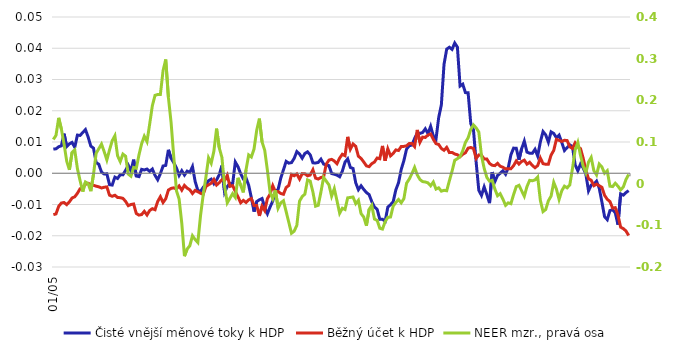
| Category | Čisté vnější měnové toky k HDP | Běžný účet k HDP |
|---|---|---|
| 2005-01-01 | 0.008 | -0.013 |
| 2005-02-01 | 0.008 | -0.013 |
| 2005-03-01 | 0.008 | -0.011 |
| 2005-04-01 | 0.009 | -0.01 |
| 2005-05-01 | 0.013 | -0.009 |
| 2005-06-01 | 0.009 | -0.01 |
| 2005-07-01 | 0.009 | -0.009 |
| 2005-08-01 | 0.01 | -0.008 |
| 2005-09-01 | 0.008 | -0.008 |
| 2005-10-01 | 0.012 | -0.006 |
| 2005-11-01 | 0.012 | -0.005 |
| 2005-12-01 | 0.013 | -0.004 |
| 2006-01-01 | 0.014 | -0.004 |
| 2006-02-01 | 0.012 | -0.003 |
| 2006-03-01 | 0.009 | -0.004 |
| 2006-04-01 | 0.008 | -0.004 |
| 2006-05-01 | 0.003 | -0.004 |
| 2006-06-01 | 0.003 | -0.004 |
| 2006-07-01 | 0 | -0.005 |
| 2006-08-01 | 0 | -0.004 |
| 2006-09-01 | 0 | -0.004 |
| 2006-10-01 | -0.004 | -0.007 |
| 2006-11-01 | -0.004 | -0.007 |
| 2006-12-01 | -0.001 | -0.007 |
| 2007-01-01 | -0.002 | -0.008 |
| 2007-02-01 | 0 | -0.008 |
| 2007-03-01 | -0.001 | -0.008 |
| 2007-04-01 | 0.001 | -0.009 |
| 2007-05-01 | 0.003 | -0.01 |
| 2007-06-01 | 0.001 | -0.01 |
| 2007-07-01 | 0.004 | -0.01 |
| 2007-08-01 | -0.001 | -0.013 |
| 2007-09-01 | -0.001 | -0.013 |
| 2007-10-01 | 0.001 | -0.013 |
| 2007-11-01 | 0.001 | -0.012 |
| 2007-12-01 | 0.001 | -0.013 |
| 2008-01-01 | 0.001 | -0.012 |
| 2008-02-01 | 0.001 | -0.011 |
| 2008-03-01 | -0.001 | -0.012 |
| 2008-04-01 | -0.002 | -0.009 |
| 2008-05-01 | 0 | -0.008 |
| 2008-06-01 | 0.002 | -0.009 |
| 2008-07-01 | 0.003 | -0.008 |
| 2008-08-01 | 0.008 | -0.005 |
| 2008-09-01 | 0.005 | -0.005 |
| 2008-10-01 | 0.003 | -0.005 |
| 2008-11-01 | 0.002 | -0.005 |
| 2008-12-01 | -0.001 | -0.004 |
| 2009-01-01 | 0.001 | -0.005 |
| 2009-02-01 | -0.001 | -0.004 |
| 2009-03-01 | 0.001 | -0.005 |
| 2009-04-01 | 0 | -0.005 |
| 2009-05-01 | 0.002 | -0.006 |
| 2009-06-01 | -0.003 | -0.005 |
| 2009-07-01 | -0.005 | -0.006 |
| 2009-08-01 | -0.006 | -0.006 |
| 2009-09-01 | -0.005 | -0.007 |
| 2009-10-01 | -0.004 | -0.004 |
| 2009-11-01 | -0.002 | -0.004 |
| 2009-12-01 | -0.002 | -0.003 |
| 2010-01-01 | -0.003 | -0.002 |
| 2010-02-01 | -0.002 | -0.004 |
| 2010-03-01 | 0 | -0.003 |
| 2010-04-01 | 0.002 | -0.002 |
| 2010-05-01 | -0.006 | -0.002 |
| 2010-06-01 | -0.004 | -0.001 |
| 2010-07-01 | -0.003 | -0.004 |
| 2010-08-01 | -0.003 | -0.004 |
| 2010-09-01 | 0.004 | -0.006 |
| 2010-10-01 | 0.002 | -0.008 |
| 2010-11-01 | 0 | -0.009 |
| 2010-12-01 | -0.002 | -0.009 |
| 2011-01-01 | -0.001 | -0.009 |
| 2011-02-01 | -0.004 | -0.008 |
| 2011-03-01 | -0.008 | -0.008 |
| 2011-04-01 | -0.012 | -0.01 |
| 2011-05-01 | -0.009 | -0.01 |
| 2011-06-01 | -0.008 | -0.014 |
| 2011-07-01 | -0.008 | -0.011 |
| 2011-08-01 | -0.011 | -0.012 |
| 2011-09-01 | -0.013 | -0.008 |
| 2011-10-01 | -0.011 | -0.007 |
| 2011-11-01 | -0.009 | -0.004 |
| 2011-12-01 | -0.006 | -0.006 |
| 2012-01-01 | -0.005 | -0.006 |
| 2012-02-01 | -0.002 | -0.006 |
| 2012-03-01 | 0.001 | -0.007 |
| 2012-04-01 | 0.004 | -0.005 |
| 2012-05-01 | 0.003 | -0.004 |
| 2012-06-01 | 0.003 | 0 |
| 2012-07-01 | 0.005 | -0.001 |
| 2012-08-01 | 0.007 | 0 |
| 2012-09-01 | 0.006 | -0.002 |
| 2012-10-01 | 0.005 | 0 |
| 2012-11-01 | 0.006 | 0 |
| 2012-12-01 | 0.007 | -0.001 |
| 2013-01-01 | 0.006 | -0.001 |
| 2013-02-01 | 0.003 | 0.001 |
| 2013-03-01 | 0.003 | -0.002 |
| 2013-04-01 | 0.003 | -0.002 |
| 2013-05-01 | 0.004 | -0.001 |
| 2013-06-01 | 0.003 | -0.001 |
| 2013-07-01 | 0.003 | 0.003 |
| 2013-08-01 | 0.002 | 0.004 |
| 2013-09-01 | 0 | 0.004 |
| 2013-10-01 | 0 | 0.004 |
| 2013-11-01 | -0.001 | 0.003 |
| 2013-12-01 | -0.001 | 0.005 |
| 2014-01-01 | 0.001 | 0.006 |
| 2014-02-01 | 0.004 | 0.006 |
| 2014-03-01 | 0.005 | 0.012 |
| 2014-04-01 | 0.002 | 0.008 |
| 2014-05-01 | 0.002 | 0.009 |
| 2014-06-01 | -0.003 | 0.009 |
| 2014-07-01 | -0.005 | 0.005 |
| 2014-08-01 | -0.004 | 0.005 |
| 2014-09-01 | -0.005 | 0.004 |
| 2014-10-01 | -0.006 | 0.002 |
| 2014-11-01 | -0.007 | 0.002 |
| 2014-12-01 | -0.009 | 0.003 |
| 2015-01-01 | -0.011 | 0.004 |
| 2015-02-01 | -0.012 | 0.005 |
| 2015-03-01 | -0.015 | 0.005 |
| 2015-04-01 | -0.015 | 0.009 |
| 2015-05-01 | -0.015 | 0.004 |
| 2015-06-01 | -0.011 | 0.008 |
| 2015-07-01 | -0.01 | 0.006 |
| 2015-08-01 | -0.009 | 0.006 |
| 2015-09-01 | -0.005 | 0.007 |
| 2015-10-01 | -0.003 | 0.007 |
| 2015-11-01 | 0.001 | 0.009 |
| 2015-12-01 | 0.004 | 0.009 |
| 2016-01-01 | 0.008 | 0.009 |
| 2016-02-01 | 0.009 | 0.01 |
| 2016-03-01 | 0.009 | 0.01 |
| 2016-04-01 | 0.011 | 0.009 |
| 2016-05-01 | 0.013 | 0.014 |
| 2016-06-01 | 0.013 | 0.01 |
| 2016-07-01 | 0.013 | 0.012 |
| 2016-08-01 | 0.014 | 0.011 |
| 2016-09-01 | 0.013 | 0.012 |
| 2016-10-01 | 0.015 | 0.013 |
| 2016-11-01 | 0.012 | 0.011 |
| 2016-12-01 | 0.011 | 0.009 |
| 2017-01-01 | 0.018 | 0.009 |
| 2017-02-01 | 0.022 | 0.008 |
| 2017-03-01 | 0.035 | 0.007 |
| 2017-04-01 | 0.04 | 0.008 |
| 2017-05-01 | 0.04 | 0.007 |
| 2017-06-01 | 0.04 | 0.007 |
| 2017-07-01 | 0.042 | 0.006 |
| 2017-08-01 | 0.04 | 0.006 |
| 2017-09-01 | 0.028 | 0.005 |
| 2017-10-01 | 0.028 | 0.006 |
| 2017-11-01 | 0.026 | 0.007 |
| 2017-12-01 | 0.026 | 0.008 |
| 2018-01-01 | 0.016 | 0.008 |
| 2018-02-01 | 0.014 | 0.008 |
| 2018-03-01 | 0.004 | 0.005 |
| 2018-04-01 | -0.005 | 0.006 |
| 2018-05-01 | -0.007 | 0.006 |
| 2018-06-01 | -0.004 | 0.005 |
| 2018-07-01 | -0.007 | 0.005 |
| 2018-08-01 | -0.01 | 0.003 |
| 2018-09-01 | 0 | 0.003 |
| 2018-10-01 | -0.003 | 0.002 |
| 2018-11-01 | -0.001 | 0.003 |
| 2018-12-01 | 0 | 0.002 |
| 2019-01-01 | 0.001 | 0.002 |
| 2019-02-01 | 0 | 0.001 |
| 2019-03-01 | 0.002 | 0.001 |
| 2019-04-01 | 0.006 | 0.001 |
| 2019-05-01 | 0.008 | 0.002 |
| 2019-06-01 | 0.008 | 0.004 |
| 2019-07-01 | 0.004 | 0.003 |
| 2019-08-01 | 0.008 | 0.004 |
| 2019-09-01 | 0.01 | 0.004 |
| 2019-10-01 | 0.007 | 0.003 |
| 2019-11-01 | 0.006 | 0.004 |
| 2019-12-01 | 0.006 | 0.002 |
| 2020-01-01 | 0.008 | 0.002 |
| 2020-02-01 | 0.006 | 0.002 |
| 2020-03-01 | 0.01 | 0.005 |
| 2020-04-01 | 0.013 | 0.003 |
| 2020-05-01 | 0.012 | 0.003 |
| 2020-06-01 | 0.01 | 0.003 |
| 2020-07-01 | 0.013 | 0.006 |
| 2020-08-01 | 0.013 | 0.007 |
| 2020-09-01 | 0.011 | 0.011 |
| 2020-10-01 | 0.012 | 0.011 |
| 2020-11-01 | 0.01 | 0.01 |
| 2020-12-01 | 0.007 | 0.011 |
| 2021-01-01 | 0.008 | 0.01 |
| 2021-02-01 | 0.009 | 0.008 |
| 2021-03-01 | 0.008 | 0.008 |
| 2021-04-01 | 0.003 | 0.01 |
| 2021-05-01 | 0.001 | 0.008 |
| 2021-06-01 | 0.003 | 0.008 |
| 2021-07-01 | 0.002 | 0.005 |
| 2021-08-01 | 0 | 0.001 |
| 2021-09-01 | -0.006 | -0.002 |
| 2021-10-01 | -0.004 | -0.002 |
| 2021-11-01 | -0.004 | -0.004 |
| 2021-12-01 | -0.003 | -0.003 |
| 2022-01-01 | -0.005 | -0.004 |
| 2022-02-01 | -0.009 | -0.005 |
| 2022-03-01 | -0.014 | -0.007 |
| 2022-04-01 | -0.015 | -0.008 |
| 2022-05-01 | -0.012 | -0.009 |
| 2022-06-01 | -0.012 | -0.011 |
| 2022-07-01 | -0.013 | -0.011 |
| 2022-08-01 | -0.016 | -0.013 |
| 2022-09-01 | -0.007 | -0.017 |
| 2022-10-01 | -0.007 | -0.018 |
| 2022-11-01 | -0.006 | -0.018 |
| 2022-12-01 | -0.006 | -0.02 |